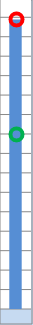
| Category | mögliche Einsparungen | Series 1 |
|---|---|---|
| 0 | 0 | -268.429 |